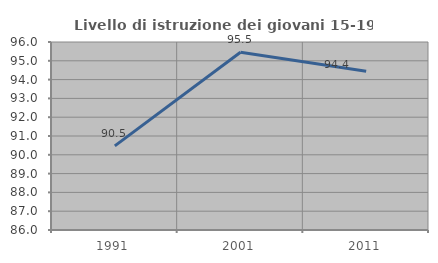
| Category | Livello di istruzione dei giovani 15-19 anni |
|---|---|
| 1991.0 | 90.476 |
| 2001.0 | 95.455 |
| 2011.0 | 94.444 |